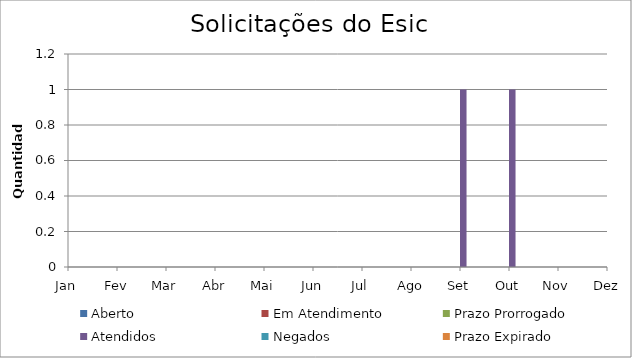
| Category | Aberto | Em Atendimento | Prazo Prorrogado | Atendidos | Negados | Prazo Expirado |
|---|---|---|---|---|---|---|
| Jan | 0 | 0 | 0 | 0 | 0 | 0 |
| Fev | 0 | 0 | 0 | 0 | 0 | 0 |
| Mar | 0 | 0 | 0 | 0 | 0 | 0 |
| Abr | 0 | 0 | 0 | 0 | 0 | 0 |
| Mai | 0 | 0 | 0 | 0 | 0 | 0 |
| Jun | 0 | 0 | 0 | 0 | 0 | 0 |
| Jul | 0 | 0 | 0 | 0 | 0 | 0 |
| Ago | 0 | 0 | 0 | 0 | 0 | 0 |
| Set | 0 | 0 | 0 | 1 | 0 | 0 |
| Out | 0 | 0 | 0 | 1 | 0 | 0 |
| Nov | 0 | 0 | 0 | 0 | 0 | 0 |
| Dez | 0 | 0 | 0 | 0 | 0 | 0 |